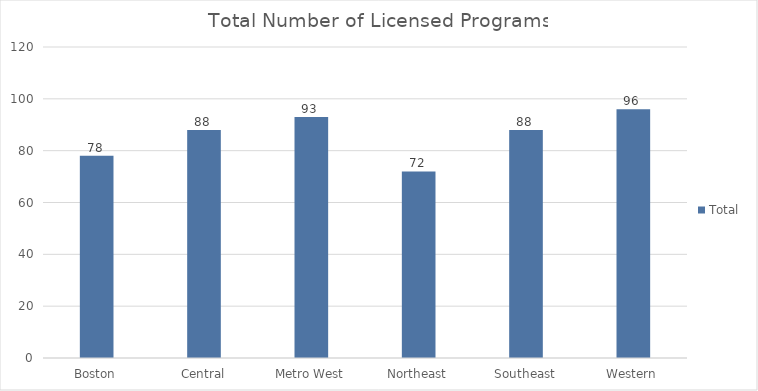
| Category | Total |
|---|---|
| Boston | 78 |
| Central | 88 |
| Metro West | 93 |
| Northeast | 72 |
| Southeast | 88 |
| Western | 96 |